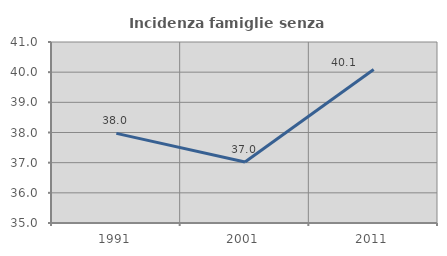
| Category | Incidenza famiglie senza nuclei |
|---|---|
| 1991.0 | 37.972 |
| 2001.0 | 37.02 |
| 2011.0 | 40.089 |